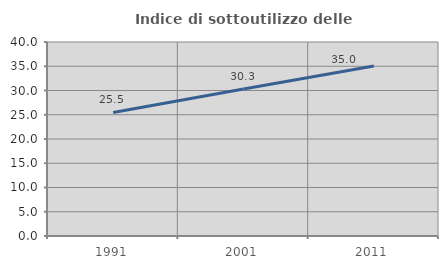
| Category | Indice di sottoutilizzo delle abitazioni  |
|---|---|
| 1991.0 | 25.478 |
| 2001.0 | 30.29 |
| 2011.0 | 35.036 |